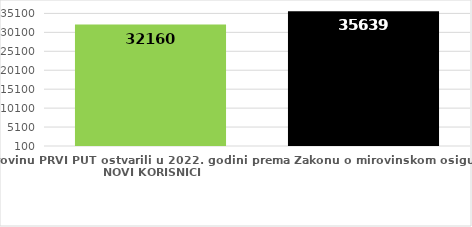
| Category | broj korisnika |
|---|---|
| Korisnici koji su pravo na mirovinu PRVI PUT ostvarili u 2022. godini prema Zakonu o mirovinskom osiguranju - NOVI KORISNICI | 32160 |
| Korisnici mirovina kojima je u 2022. godini PRESTALO PRAVO NA MIROVINU - uzrok smrt 
koji su pravo na mirovinu ostvarili prema Zakonu o mirovinskom osiguranju | 35639 |